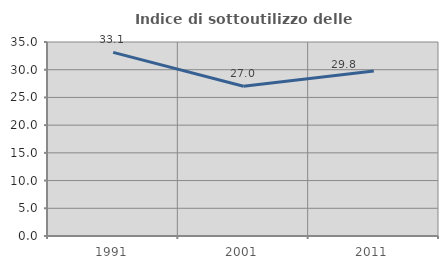
| Category | Indice di sottoutilizzo delle abitazioni  |
|---|---|
| 1991.0 | 33.133 |
| 2001.0 | 27.019 |
| 2011.0 | 29.765 |